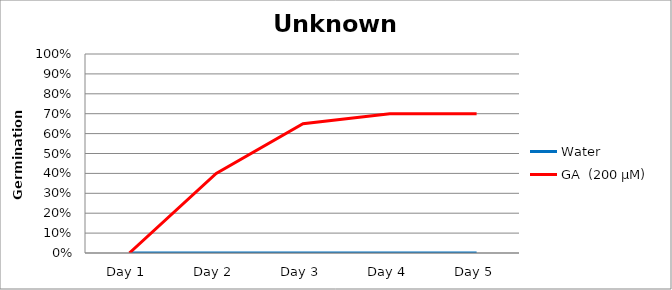
| Category | Water | GA  (200 µM)  |
|---|---|---|
| Day 1 | 0 | 0 |
| Day 2 | 0 | 0.4 |
| Day 3 | 0 | 0.65 |
| Day 4 | 0 | 0.7 |
| Day 5 | 0 | 0.7 |